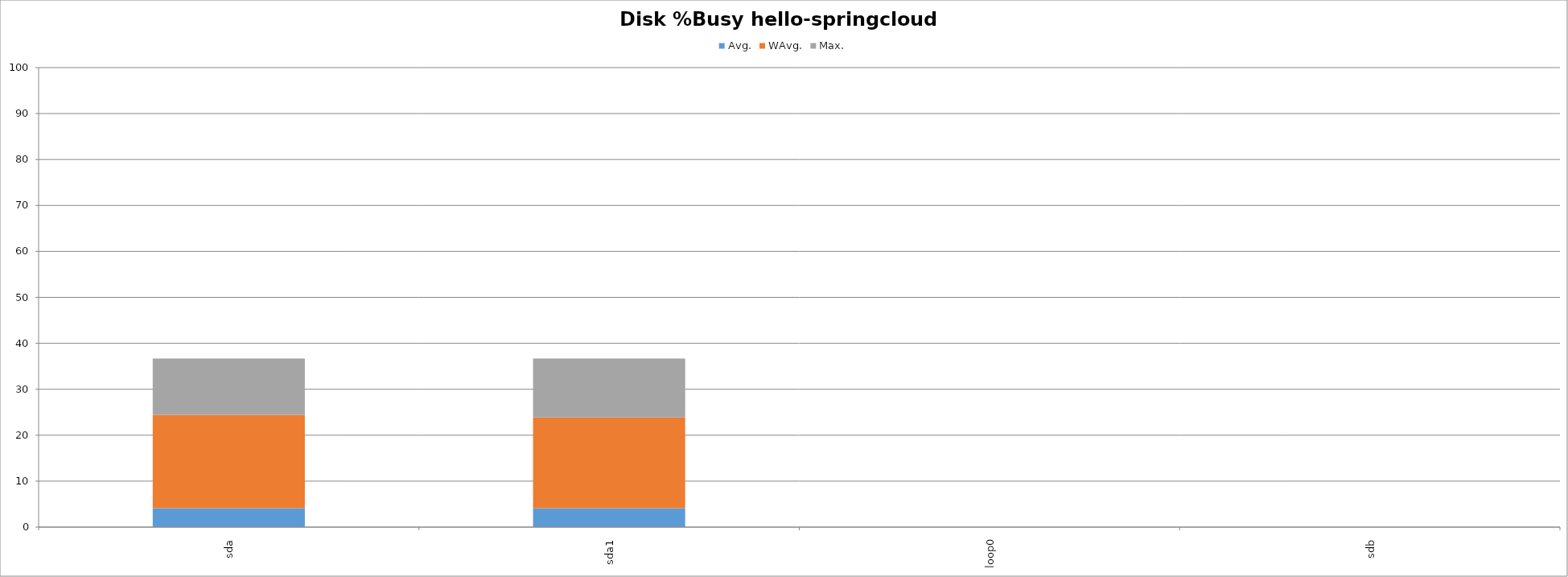
| Category | Avg. | WAvg. | Max. |
|---|---|---|---|
| sda | 4.095 | 20.331 | 12.274 |
| sda1 | 4.099 | 19.777 | 12.824 |
| loop0 | 0 | 0 | 0 |
| sdb | 0 | 0 | 0 |